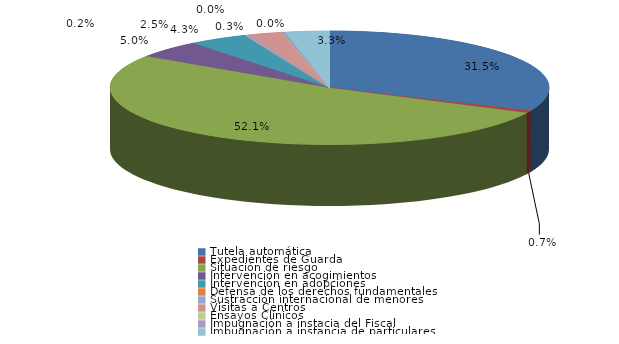
| Category | Series 0 |
|---|---|
| Tutela automática | 386 |
| Expedientes de Guarda | 9 |
| Situación de riesgo | 638 |
| Intervención en acogimientos | 61 |
| Intervención en adopciones | 53 |
| Defensa de los derechos fundamentales | 0 |
| Sustracción internacional de menores | 4 |
| Visitas a Centros | 30 |
| Ensayos Clínicos | 0 |
| Impugnación a instacia del Fiscal | 3 |
| Impugnación a instancia de particulares | 40 |